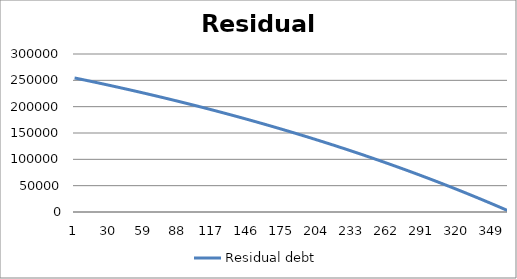
| Category | Residual debt |
|---|---|
| 0 | 254529.167 |
| 1 | 254057.352 |
| 2 | 253584.555 |
| 3 | 253110.773 |
| 4 | 252636.004 |
| 5 | 252160.246 |
| 6 | 251683.496 |
| 7 | 251205.753 |
| 8 | 250727.015 |
| 9 | 250247.28 |
| 10 | 249766.545 |
| 11 | 249284.809 |
| 12 | 248802.069 |
| 13 | 248318.323 |
| 14 | 247833.57 |
| 15 | 247347.806 |
| 16 | 246861.031 |
| 17 | 246373.241 |
| 18 | 245884.435 |
| 19 | 245394.611 |
| 20 | 244903.767 |
| 21 | 244411.9 |
| 22 | 243919.008 |
| 23 | 243425.089 |
| 24 | 242930.141 |
| 25 | 242434.162 |
| 26 | 241937.15 |
| 27 | 241439.103 |
| 28 | 240940.018 |
| 29 | 240439.893 |
| 30 | 239938.726 |
| 31 | 239436.515 |
| 32 | 238933.257 |
| 33 | 238428.952 |
| 34 | 237923.595 |
| 35 | 237417.186 |
| 36 | 236909.722 |
| 37 | 236401.201 |
| 38 | 235891.62 |
| 39 | 235380.977 |
| 40 | 234869.271 |
| 41 | 234356.499 |
| 42 | 233842.658 |
| 43 | 233327.747 |
| 44 | 232811.763 |
| 45 | 232294.704 |
| 46 | 231776.568 |
| 47 | 231257.353 |
| 48 | 230737.055 |
| 49 | 230215.674 |
| 50 | 229693.207 |
| 51 | 229169.651 |
| 52 | 228645.005 |
| 53 | 228119.265 |
| 54 | 227592.43 |
| 55 | 227064.498 |
| 56 | 226535.465 |
| 57 | 226005.331 |
| 58 | 225474.092 |
| 59 | 224941.746 |
| 60 | 224408.292 |
| 61 | 223873.726 |
| 62 | 223338.046 |
| 63 | 222801.25 |
| 64 | 222263.336 |
| 65 | 221724.301 |
| 66 | 221184.144 |
| 67 | 220642.861 |
| 68 | 220100.45 |
| 69 | 219556.909 |
| 70 | 219012.236 |
| 71 | 218466.428 |
| 72 | 217919.483 |
| 73 | 217371.399 |
| 74 | 216822.173 |
| 75 | 216271.802 |
| 76 | 215720.285 |
| 77 | 215167.619 |
| 78 | 214613.802 |
| 79 | 214058.83 |
| 80 | 213502.703 |
| 81 | 212945.417 |
| 82 | 212386.97 |
| 83 | 211827.359 |
| 84 | 211266.583 |
| 85 | 210704.638 |
| 86 | 210141.523 |
| 87 | 209577.235 |
| 88 | 209011.771 |
| 89 | 208445.128 |
| 90 | 207877.306 |
| 91 | 207308.3 |
| 92 | 206738.109 |
| 93 | 206166.73 |
| 94 | 205594.161 |
| 95 | 205020.399 |
| 96 | 204445.441 |
| 97 | 203869.286 |
| 98 | 203291.93 |
| 99 | 202713.372 |
| 100 | 202133.608 |
| 101 | 201552.636 |
| 102 | 200970.454 |
| 103 | 200387.059 |
| 104 | 199802.449 |
| 105 | 199216.621 |
| 106 | 198629.572 |
| 107 | 198041.3 |
| 108 | 197451.803 |
| 109 | 196861.078 |
| 110 | 196269.122 |
| 111 | 195675.932 |
| 112 | 195081.507 |
| 113 | 194485.844 |
| 114 | 193888.939 |
| 115 | 193290.791 |
| 116 | 192691.397 |
| 117 | 192090.754 |
| 118 | 191488.86 |
| 119 | 190885.711 |
| 120 | 190281.307 |
| 121 | 189675.643 |
| 122 | 189068.717 |
| 123 | 188460.527 |
| 124 | 187851.07 |
| 125 | 187240.343 |
| 126 | 186628.343 |
| 127 | 186015.069 |
| 128 | 185400.517 |
| 129 | 184784.685 |
| 130 | 184167.57 |
| 131 | 183549.169 |
| 132 | 182929.48 |
| 133 | 182308.499 |
| 134 | 181686.225 |
| 135 | 181062.655 |
| 136 | 180437.785 |
| 137 | 179811.614 |
| 138 | 179184.138 |
| 139 | 178555.355 |
| 140 | 177925.262 |
| 141 | 177293.857 |
| 142 | 176661.136 |
| 143 | 176027.096 |
| 144 | 175391.736 |
| 145 | 174755.052 |
| 146 | 174117.042 |
| 147 | 173477.702 |
| 148 | 172837.031 |
| 149 | 172195.025 |
| 150 | 171551.681 |
| 151 | 170906.997 |
| 152 | 170260.97 |
| 153 | 169613.597 |
| 154 | 168964.875 |
| 155 | 168314.802 |
| 156 | 167663.375 |
| 157 | 167010.59 |
| 158 | 166356.445 |
| 159 | 165700.938 |
| 160 | 165044.065 |
| 161 | 164385.823 |
| 162 | 163726.21 |
| 163 | 163065.223 |
| 164 | 162402.859 |
| 165 | 161739.115 |
| 166 | 161073.988 |
| 167 | 160407.476 |
| 168 | 159739.575 |
| 169 | 159070.282 |
| 170 | 158399.595 |
| 171 | 157727.511 |
| 172 | 157054.027 |
| 173 | 156379.139 |
| 174 | 155702.846 |
| 175 | 155025.143 |
| 176 | 154346.029 |
| 177 | 153665.5 |
| 178 | 152983.553 |
| 179 | 152300.186 |
| 180 | 151615.394 |
| 181 | 150929.176 |
| 182 | 150241.529 |
| 183 | 149552.449 |
| 184 | 148861.933 |
| 185 | 148169.979 |
| 186 | 147476.583 |
| 187 | 146781.742 |
| 188 | 146085.454 |
| 189 | 145387.716 |
| 190 | 144688.523 |
| 191 | 143987.875 |
| 192 | 143285.766 |
| 193 | 142582.195 |
| 194 | 141877.157 |
| 195 | 141170.652 |
| 196 | 140462.674 |
| 197 | 139753.221 |
| 198 | 139042.29 |
| 199 | 138329.878 |
| 200 | 137615.982 |
| 201 | 136900.599 |
| 202 | 136183.725 |
| 203 | 135465.358 |
| 204 | 134745.494 |
| 205 | 134024.13 |
| 206 | 133301.264 |
| 207 | 132576.892 |
| 208 | 131851.01 |
| 209 | 131123.617 |
| 210 | 130394.707 |
| 211 | 129664.28 |
| 212 | 128932.33 |
| 213 | 128198.856 |
| 214 | 127463.854 |
| 215 | 126727.32 |
| 216 | 125989.252 |
| 217 | 125249.646 |
| 218 | 124508.5 |
| 219 | 123765.809 |
| 220 | 123021.571 |
| 221 | 122275.783 |
| 222 | 121528.441 |
| 223 | 120779.541 |
| 224 | 120029.082 |
| 225 | 119277.059 |
| 226 | 118523.47 |
| 227 | 117768.311 |
| 228 | 117011.578 |
| 229 | 116253.269 |
| 230 | 115493.38 |
| 231 | 114731.907 |
| 232 | 113968.849 |
| 233 | 113204.201 |
| 234 | 112437.959 |
| 235 | 111670.122 |
| 236 | 110900.685 |
| 237 | 110129.644 |
| 238 | 109356.998 |
| 239 | 108582.742 |
| 240 | 107806.872 |
| 241 | 107029.387 |
| 242 | 106250.281 |
| 243 | 105469.553 |
| 244 | 104687.197 |
| 245 | 103903.212 |
| 246 | 103117.594 |
| 247 | 102330.339 |
| 248 | 101541.444 |
| 249 | 100750.905 |
| 250 | 99958.72 |
| 251 | 99164.884 |
| 252 | 98369.394 |
| 253 | 97572.247 |
| 254 | 96773.439 |
| 255 | 95972.967 |
| 256 | 95170.827 |
| 257 | 94367.017 |
| 258 | 93561.531 |
| 259 | 92754.368 |
| 260 | 91945.523 |
| 261 | 91134.992 |
| 262 | 90322.774 |
| 263 | 89508.863 |
| 264 | 88693.256 |
| 265 | 87875.951 |
| 266 | 87056.942 |
| 267 | 86236.227 |
| 268 | 85413.803 |
| 269 | 84589.665 |
| 270 | 83763.81 |
| 271 | 82936.235 |
| 272 | 82106.935 |
| 273 | 81275.908 |
| 274 | 80443.149 |
| 275 | 79608.656 |
| 276 | 78772.424 |
| 277 | 77934.45 |
| 278 | 77094.73 |
| 279 | 76253.261 |
| 280 | 75410.038 |
| 281 | 74565.059 |
| 282 | 73718.32 |
| 283 | 72869.816 |
| 284 | 72019.545 |
| 285 | 71167.502 |
| 286 | 70313.685 |
| 287 | 69458.088 |
| 288 | 68600.709 |
| 289 | 67741.544 |
| 290 | 66880.589 |
| 291 | 66017.84 |
| 292 | 65153.294 |
| 293 | 64286.947 |
| 294 | 63418.795 |
| 295 | 62548.834 |
| 296 | 61677.06 |
| 297 | 60803.471 |
| 298 | 59928.062 |
| 299 | 59050.828 |
| 300 | 58171.768 |
| 301 | 57290.875 |
| 302 | 56408.148 |
| 303 | 55523.582 |
| 304 | 54637.173 |
| 305 | 53748.917 |
| 306 | 52858.81 |
| 307 | 51966.849 |
| 308 | 51073.03 |
| 309 | 50177.349 |
| 310 | 49279.802 |
| 311 | 48380.385 |
| 312 | 47479.094 |
| 313 | 46575.925 |
| 314 | 45670.875 |
| 315 | 44763.94 |
| 316 | 43855.115 |
| 317 | 42944.396 |
| 318 | 42031.78 |
| 319 | 41117.263 |
| 320 | 40200.841 |
| 321 | 39282.509 |
| 322 | 38362.264 |
| 323 | 37440.102 |
| 324 | 36516.019 |
| 325 | 35590.011 |
| 326 | 34662.073 |
| 327 | 33732.203 |
| 328 | 32800.395 |
| 329 | 31866.646 |
| 330 | 30930.951 |
| 331 | 29993.307 |
| 332 | 29053.71 |
| 333 | 28112.155 |
| 334 | 27168.639 |
| 335 | 26223.157 |
| 336 | 25275.705 |
| 337 | 24326.28 |
| 338 | 23374.876 |
| 339 | 22421.49 |
| 340 | 21466.118 |
| 341 | 20508.756 |
| 342 | 19549.399 |
| 343 | 18588.044 |
| 344 | 17624.686 |
| 345 | 16659.321 |
| 346 | 15691.944 |
| 347 | 14722.552 |
| 348 | 13751.141 |
| 349 | 12777.706 |
| 350 | 11802.243 |
| 351 | 10824.747 |
| 352 | 9845.216 |
| 353 | 8863.643 |
| 354 | 7880.026 |
| 355 | 6894.359 |
| 356 | 5906.639 |
| 357 | 4916.861 |
| 358 | 3925.021 |
| 359 | 2931.115 |